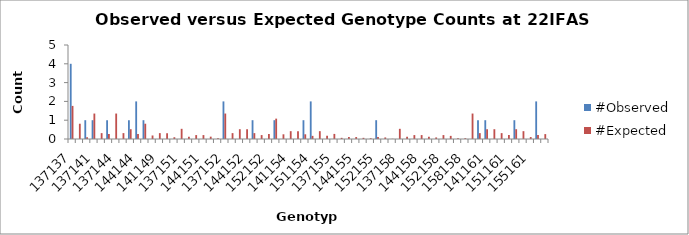
| Category | #Observed | #Expected |
|---|---|---|
| 137137.0 | 4 | 1.76 |
| 137139.0 | 0 | 0.812 |
| 139139.0 | 1 | 0.094 |
| 137141.0 | 1 | 1.354 |
| 139141.0 | 0 | 0.312 |
| 141141.0 | 1 | 0.26 |
| 137144.0 | 0 | 1.354 |
| 139144.0 | 0 | 0.312 |
| 141144.0 | 1 | 0.521 |
| 144144.0 | 2 | 0.26 |
| 137149.0 | 1 | 0.812 |
| 139149.0 | 0 | 0.188 |
| 141149.0 | 0 | 0.312 |
| 144149.0 | 0 | 0.312 |
| 149149.0 | 0 | 0.094 |
| 137151.0 | 0 | 0.542 |
| 139151.0 | 0 | 0.125 |
| 141151.0 | 0 | 0.208 |
| 144151.0 | 0 | 0.208 |
| 149151.0 | 0 | 0.125 |
| 151151.0 | 0 | 0.042 |
| 137152.0 | 2 | 1.354 |
| 139152.0 | 0 | 0.312 |
| 141152.0 | 0 | 0.521 |
| 144152.0 | 0 | 0.521 |
| 149152.0 | 1 | 0.312 |
| 151152.0 | 0 | 0.208 |
| 152152.0 | 0 | 0.26 |
| 137154.0 | 1 | 1.083 |
| 139154.0 | 0 | 0.25 |
| 141154.0 | 0 | 0.417 |
| 144154.0 | 0 | 0.417 |
| 149154.0 | 1 | 0.25 |
| 151154.0 | 2 | 0.167 |
| 152154.0 | 0 | 0.417 |
| 154154.0 | 0 | 0.167 |
| 137155.0 | 0 | 0.271 |
| 139155.0 | 0 | 0.062 |
| 141155.0 | 0 | 0.104 |
| 144155.0 | 0 | 0.104 |
| 149155.0 | 0 | 0.062 |
| 151155.0 | 0 | 0.042 |
| 152155.0 | 1 | 0.104 |
| 154155.0 | 0 | 0.083 |
| 155155.0 | 0 | 0.01 |
| 137158.0 | 0 | 0.542 |
| 139158.0 | 0 | 0.125 |
| 141158.0 | 0 | 0.208 |
| 144158.0 | 0 | 0.208 |
| 149158.0 | 0 | 0.125 |
| 151158.0 | 0 | 0.083 |
| 152158.0 | 0 | 0.208 |
| 154158.0 | 0 | 0.167 |
| 155158.0 | 0 | 0.042 |
| 158158.0 | 0 | 0.042 |
| 137161.0 | 0 | 1.354 |
| 139161.0 | 1 | 0.312 |
| 141161.0 | 1 | 0.521 |
| 144161.0 | 0 | 0.521 |
| 149161.0 | 0 | 0.312 |
| 151161.0 | 0 | 0.208 |
| 152161.0 | 1 | 0.521 |
| 154161.0 | 0 | 0.417 |
| 155161.0 | 0 | 0.104 |
| 158161.0 | 2 | 0.208 |
| 161161.0 | 0 | 0.26 |